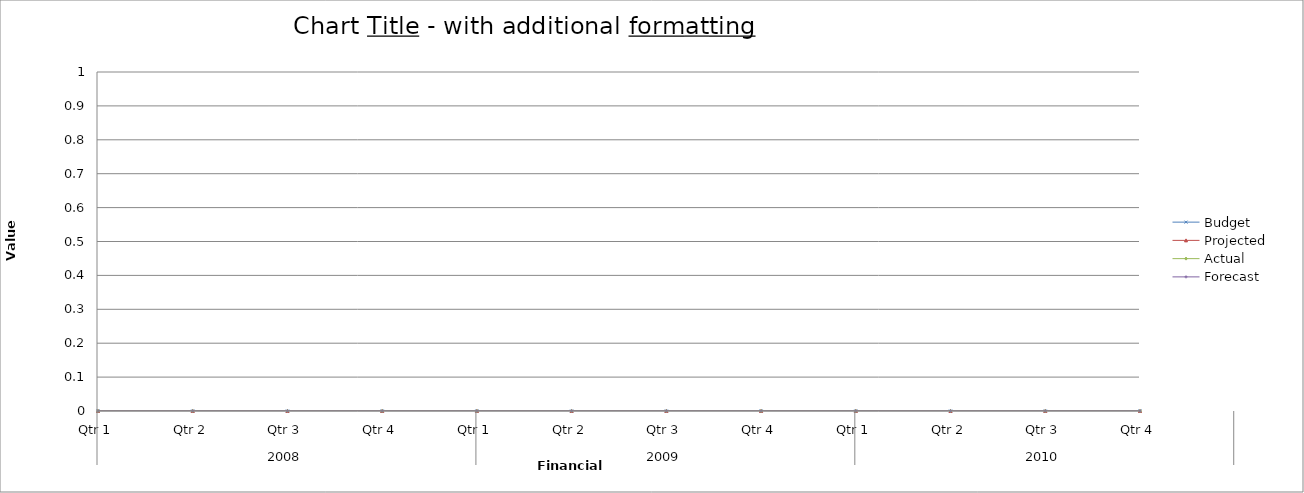
| Category | Budget | Projected | Actual | Forecast |
|---|---|---|---|---|
| 0 | 1510 | 920 | 810 | 760 |
| 1 | 2830 | 2310 | 2980 | 2940 |
| 2 | 2490 | 2160 | 740 | 1750 |
| 3 | 1280 | 3230 | 1890 | 1740 |
| 4 | 1950 | 550 | 3060 | 3190 |
| 5 | 3460 | 2040 | 1680 | 2280 |
| 6 | 3490 | 2520 | 2360 | 3320 |
| 7 | 3240 | 2800 | 3270 | 1400 |
| 8 | 660 | 1330 | 2800 | 1280 |
| 9 | 2630 | 1430 | 2140 | 2170 |
| 10 | 1670 | 880 | 2750 | 1220 |
| 11 | 2200 | 740 | 2640 | 2540 |